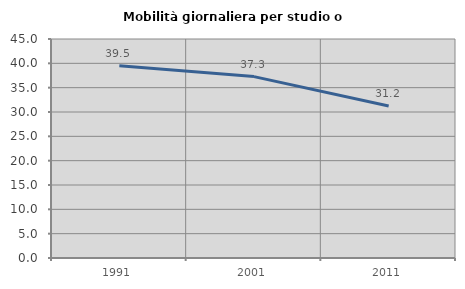
| Category | Mobilità giornaliera per studio o lavoro |
|---|---|
| 1991.0 | 39.489 |
| 2001.0 | 37.273 |
| 2011.0 | 31.217 |